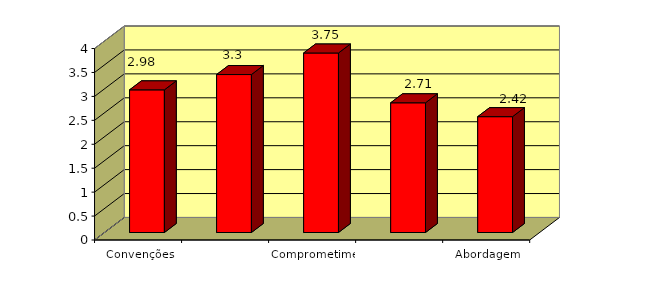
| Category | Series 0 |
|---|---|
| Convenções Sociais | 2.98 |
| Regras e Juízes | 3.3 |
| Comprometimento com o Esporte | 3.75 |
| Preocupação pelo Oponente | 2.71 |
| Abordagem Negativa | 2.42 |